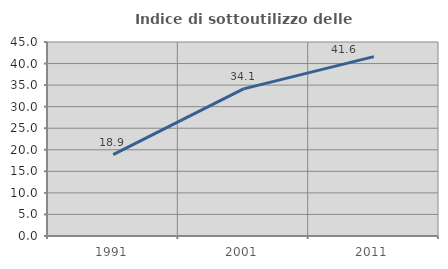
| Category | Indice di sottoutilizzo delle abitazioni  |
|---|---|
| 1991.0 | 18.883 |
| 2001.0 | 34.136 |
| 2011.0 | 41.608 |